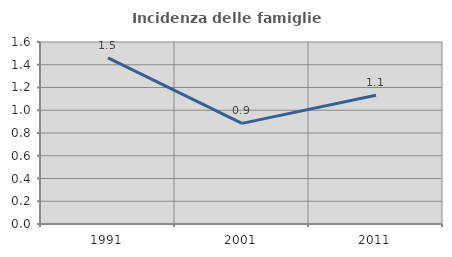
| Category | Incidenza delle famiglie numerose |
|---|---|
| 1991.0 | 1.46 |
| 2001.0 | 0.885 |
| 2011.0 | 1.131 |